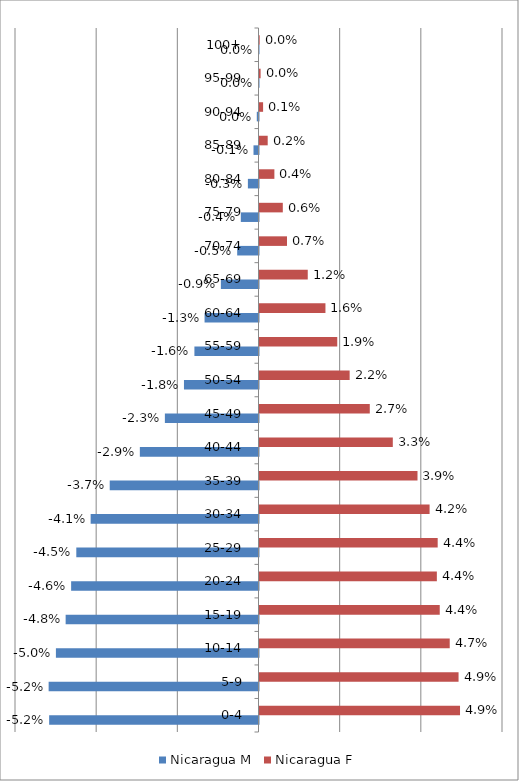
| Category |  Nicaragua   M  |  Nicaragua   F  |
|---|---|---|
| 0-4 | -0.052 | 0.049 |
| 5-9 | -0.052 | 0.049 |
| 10-14 | -0.05 | 0.047 |
| 15-19 | -0.048 | 0.044 |
| 20-24 | -0.046 | 0.044 |
| 25-29 | -0.045 | 0.044 |
| 30-34 | -0.041 | 0.042 |
| 35-39 | -0.037 | 0.039 |
| 40-44 | -0.029 | 0.033 |
| 45-49 | -0.023 | 0.027 |
| 50-54 | -0.018 | 0.022 |
| 55-59 | -0.016 | 0.019 |
| 60-64 | -0.013 | 0.016 |
| 65-69 | -0.009 | 0.012 |
| 70-74 | -0.005 | 0.007 |
| 75-79 | -0.004 | 0.006 |
| 80-84 | -0.003 | 0.004 |
| 85-89 | -0.001 | 0.002 |
| 90-94 | 0 | 0.001 |
| 95-99 | 0 | 0 |
| 100+ | 0 | 0 |